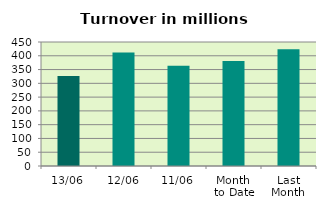
| Category | Series 0 |
|---|---|
| 13/06 | 326.432 |
| 12/06 | 412.27 |
| 11/06 | 364.11 |
| Month 
to Date | 381.273 |
| Last
Month | 424.091 |